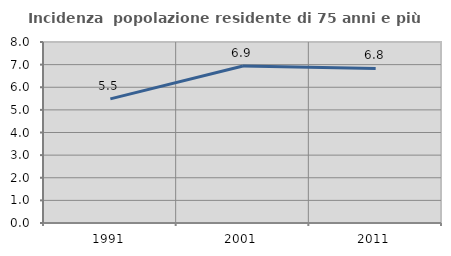
| Category | Incidenza  popolazione residente di 75 anni e più |
|---|---|
| 1991.0 | 5.487 |
| 2001.0 | 6.941 |
| 2011.0 | 6.829 |